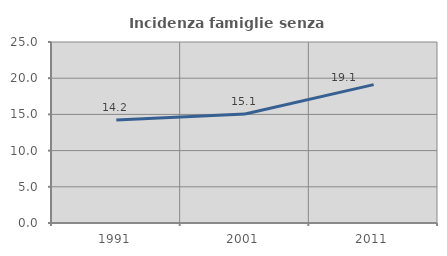
| Category | Incidenza famiglie senza nuclei |
|---|---|
| 1991.0 | 14.212 |
| 2001.0 | 15.061 |
| 2011.0 | 19.115 |